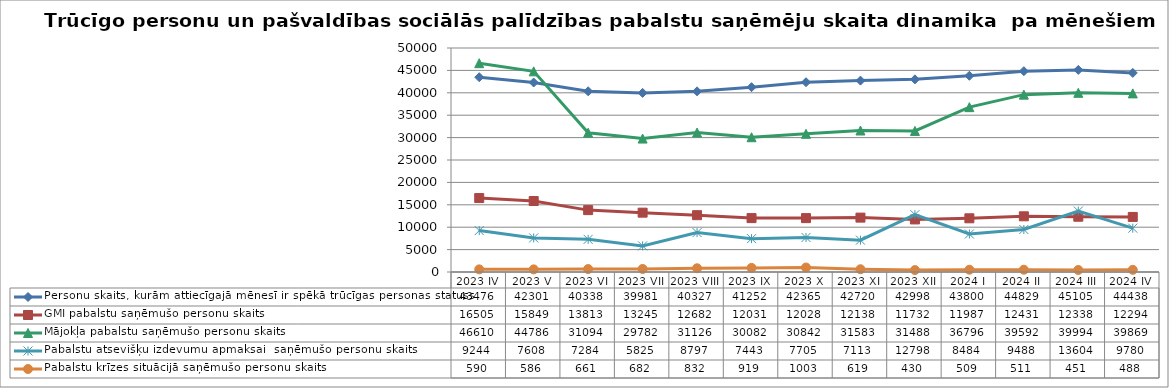
| Category | Personu skaits, kurām attiecīgajā mēnesī ir spēkā trūcīgas personas statuss | GMI pabalstu saņēmušo personu skaits | Mājokļa pabalstu saņēmušo personu skaits | Pabalstu atsevišķu izdevumu apmaksai  saņēmušo personu skaits | Pabalstu krīzes situācijā saņēmušo personu skaits |
|---|---|---|---|---|---|
| 2023 IV | 43476 | 16505 | 46610 | 9244 | 590 |
| 2023 V | 42301 | 15849 | 44786 | 7608 | 586 |
| 2023 VI | 40338 | 13813 | 31094 | 7284 | 661 |
| 2023 VII | 39981 | 13245 | 29782 | 5825 | 682 |
| 2023 VIII | 40327 | 12682 | 31126 | 8797 | 832 |
| 2023 IX | 41252 | 12031 | 30082 | 7443 | 919 |
| 2023 X | 42365 | 12028 | 30842 | 7705 | 1003 |
| 2023 XI | 42720 | 12138 | 31583 | 7113 | 619 |
| 2023 XII | 42998 | 11732 | 31488 | 12798 | 430 |
| 2024 I | 43800 | 11987 | 36796 | 8484 | 509 |
| 2024 II | 44829 | 12431 | 39592 | 9488 | 511 |
| 2024 III | 45105 | 12338 | 39994 | 13604 | 451 |
| 2024 IV | 44438 | 12294 | 39869 | 9780 | 488 |